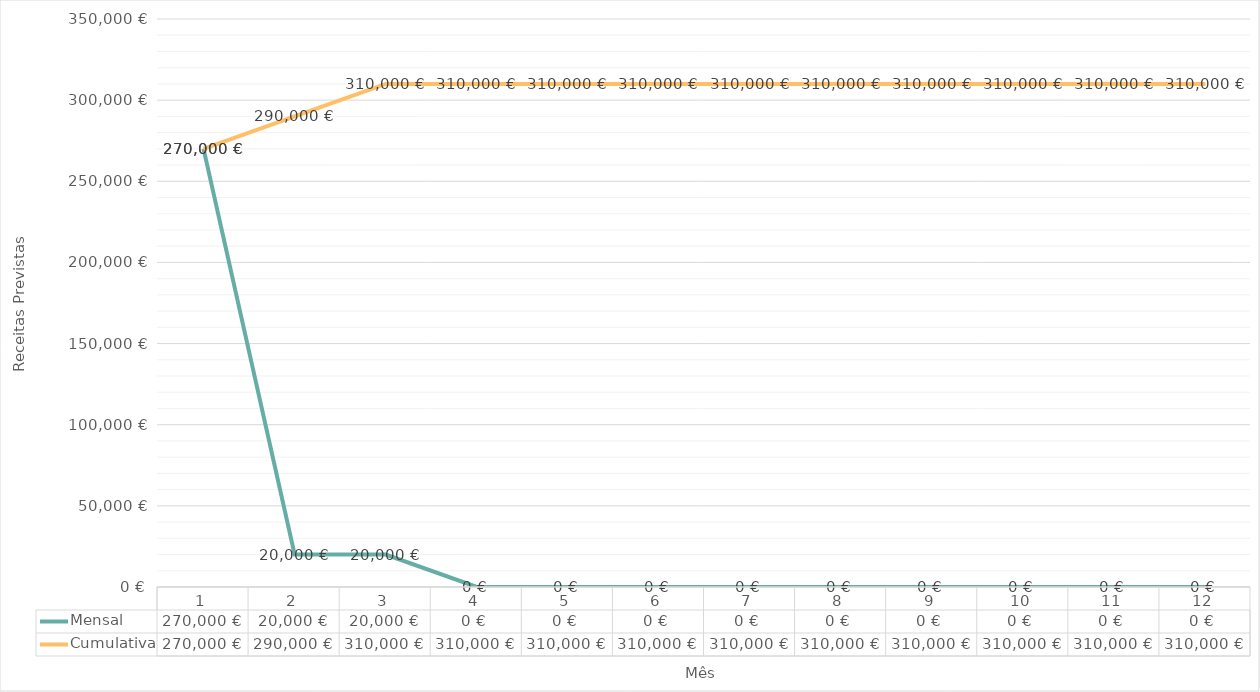
| Category | Mensal | Cumulativa |
|---|---|---|
| 0 | 270000 | 270000 |
| 1 | 20000 | 290000 |
| 2 | 20000 | 310000 |
| 3 | 0 | 310000 |
| 4 | 0 | 310000 |
| 5 | 0 | 310000 |
| 6 | 0 | 310000 |
| 7 | 0 | 310000 |
| 8 | 0 | 310000 |
| 9 | 0 | 310000 |
| 10 | 0 | 310000 |
| 11 | 0 | 310000 |